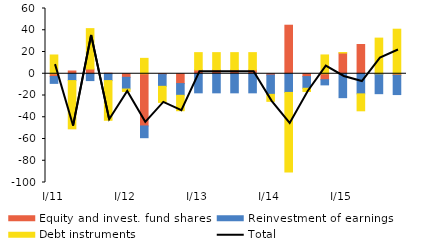
| Category | Equity and invest. fund shares | Reinvestment of earnings | Debt instruments |
|---|---|---|---|
| I/11 | -2.569 | -6.291 | 17.255 |
| II | 2.527 | -6.291 | -44.364 |
| III | 4.362 | -6.291 | 37.132 |
| IV | 0.507 | -6.291 | -36.489 |
| I/12 | -3.253 | -10.785 | -2.251 |
| II | -48.016 | -10.785 | 14.16 |
| III | -0.777 | -10.785 | -14.771 |
| IV | -9.051 | -10.785 | -14.161 |
| I/13 | 3.515 | -17.551 | 15.896 |
| II | 3.515 | -17.551 | 15.896 |
| III | 3.515 | -17.551 | 15.896 |
| IV | 3.515 | -17.551 | 15.896 |
| I/14 | -1.198 | -17.743 | -6.432 |
| II | 44.625 | -17.186 | -73.154 |
| III | -2.62 | -10.736 | -2.994 |
| IV | -5.482 | -4.752 | 17.289 |
| I/15 | 19.073 | -21.986 | 0.416 |
| II | 26.914 | -18.494 | -15.581 |
| III | -0.506 | -17.814 | 32.777 |
| IV | -1.392 | -17.753 | 40.964 |